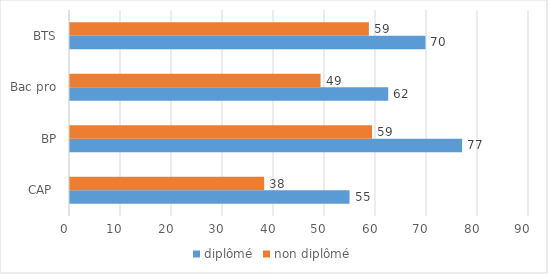
| Category | diplômé | non diplômé |
|---|---|---|
| CAP  | 54.81 | 38.08 |
| BP | 76.89 | 59.22 |
| Bac pro | 62.4 | 49.13 |
| BTS | 69.7 | 58.6 |